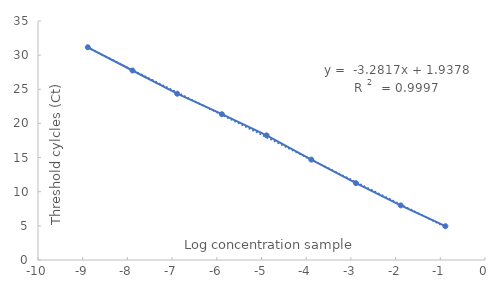
| Category | Av. Ct |
|---|---|
| -0.8860566476931632 | 4.95 |
| -1.8860566476931633 | 8 |
| -2.886056647693163 | 11.25 |
| -3.886056647693163 | 14.7 |
| -4.886056647693163 | 18.25 |
| -5.886056647693163 | 21.35 |
| -6.886056647693163 | 24.35 |
| -7.886056647693163 | 27.75 |
| -8.886056647693163 | 31.15 |